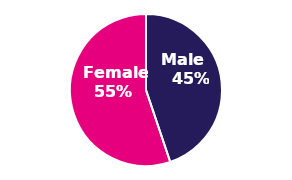
| Category | Series 0 |
|---|---|
| 0 | 113874 |
| 1 | 140160 |